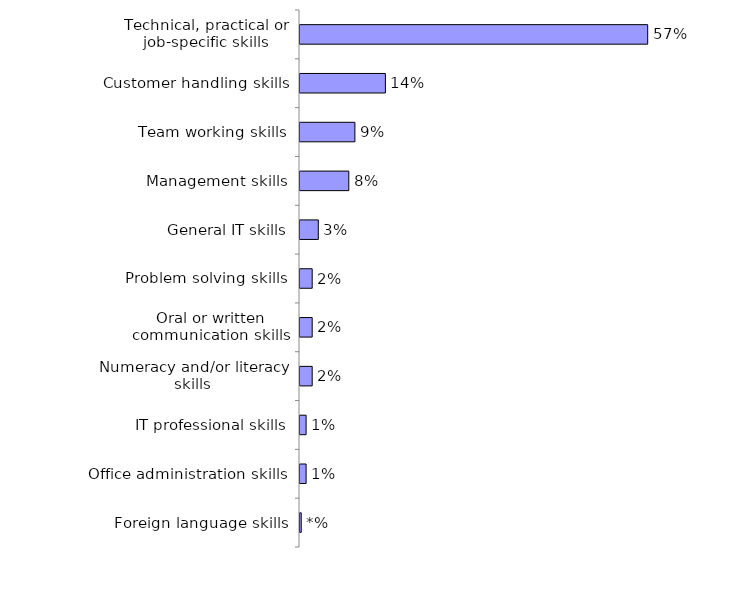
| Category | Series 0 |
|---|---|
| Technical, practical or job-specific skills | 0.57 |
| Customer handling skills | 0.14 |
| Team working skills | 0.09 |
| Management skills | 0.08 |
| General IT skills | 0.03 |
| Problem solving skills | 0.02 |
| Oral or written communication skills | 0.02 |
| Numeracy and/or literacy skills | 0.02 |
| IT professional skills | 0.01 |
| Office administration skills | 0.01 |
| Foreign language skills | 0.002 |